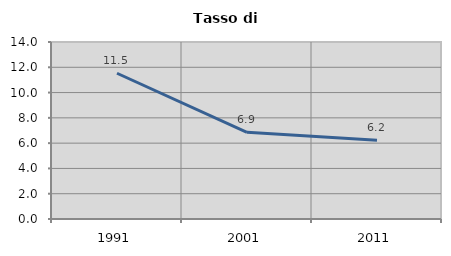
| Category | Tasso di disoccupazione   |
|---|---|
| 1991.0 | 11.529 |
| 2001.0 | 6.86 |
| 2011.0 | 6.234 |